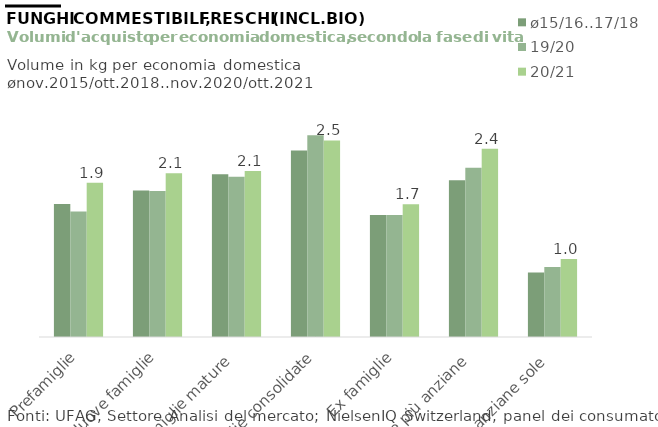
| Category | ø15/16..17/18 | 19/20 | 20/21 |
|---|---|---|---|
| Prefamiglie | 1.67 | 1.574 | 1.937 |
| Nuove famiglie | 1.84 | 1.832 | 2.057 |
| Famiglie mature | 2.043 | 2.013 | 2.082 |
| Famiglie consolidate | 2.341 | 2.532 | 2.467 |
| Ex famiglie | 1.53 | 1.53 | 1.666 |
| Coppie più anziane | 1.967 | 2.125 | 2.364 |
| Persone anziane sole | 0.809 | 0.879 | 0.98 |